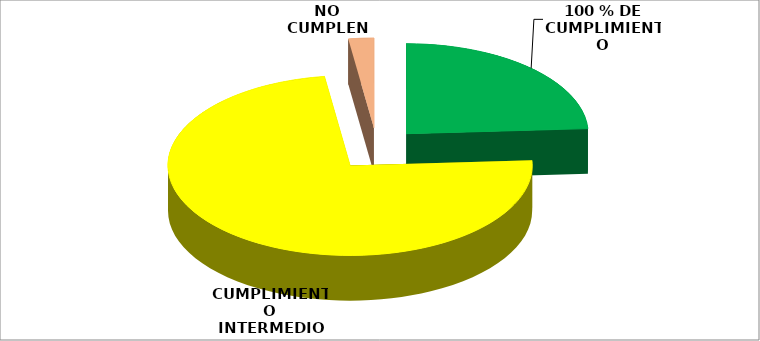
| Category | Series 0 |
|---|---|
| 100 % DE CUMPLIMIENTO | 107 |
| CUMPLIMIENTO INTERMEDIO | 327 |
| NO CUMPLEN | 10 |